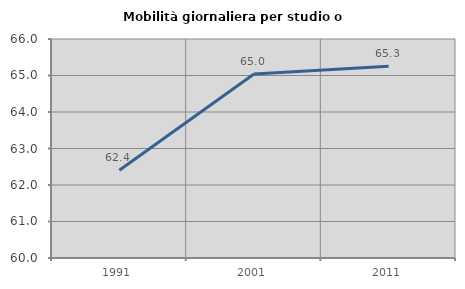
| Category | Mobilità giornaliera per studio o lavoro |
|---|---|
| 1991.0 | 62.404 |
| 2001.0 | 65.039 |
| 2011.0 | 65.254 |